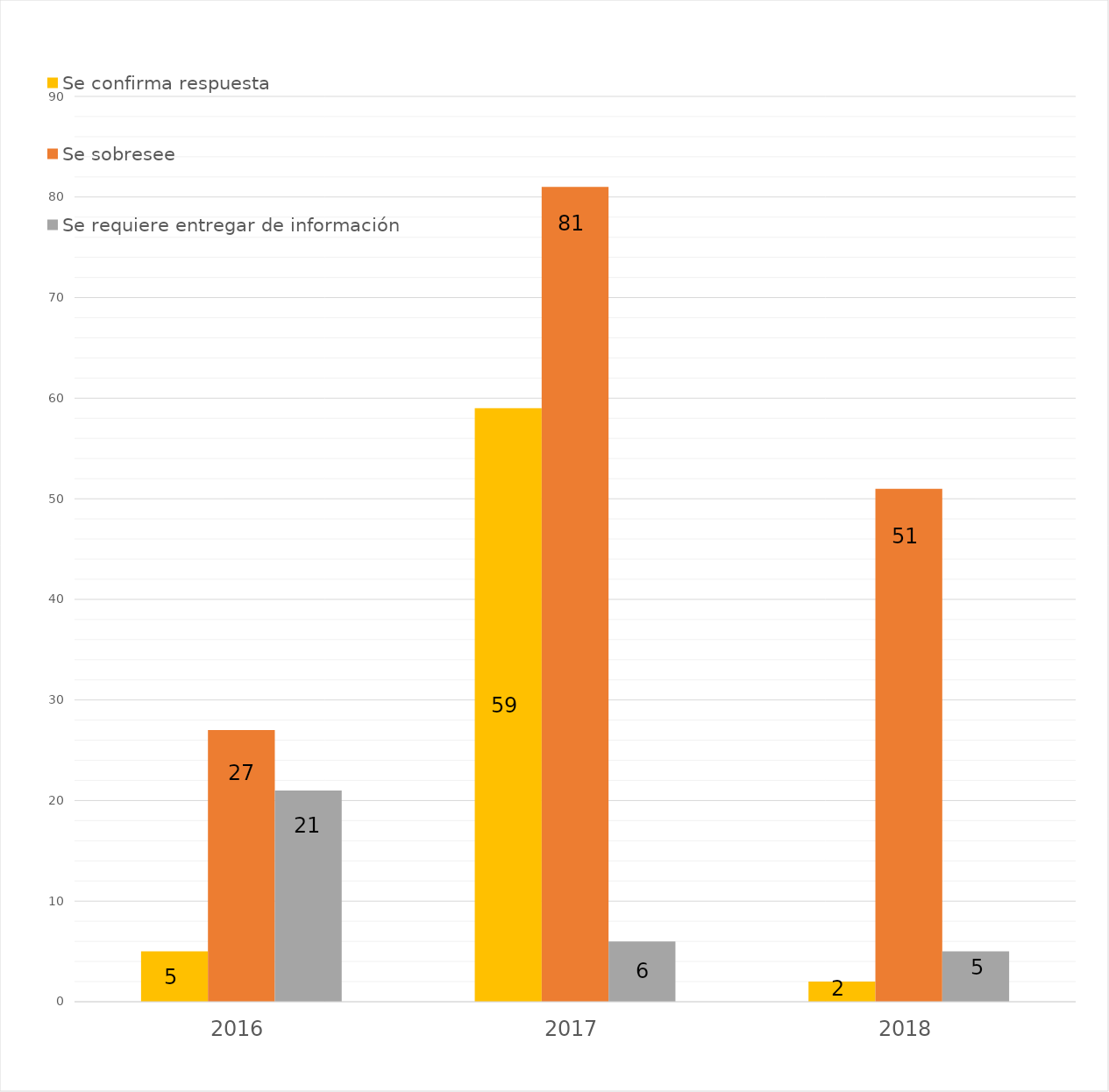
| Category | Se confirma respuesta | Se sobresee  | Se requiere entregar de información  |
|---|---|---|---|
| 2016.0 | 5 | 27 | 21 |
| 2017.0 | 59 | 81 | 6 |
| 2018.0 | 2 | 51 | 5 |